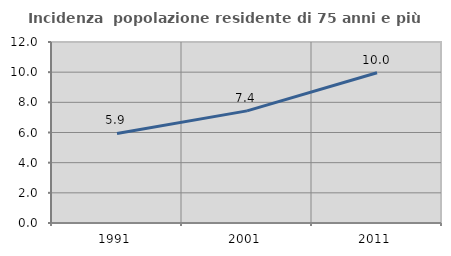
| Category | Incidenza  popolazione residente di 75 anni e più |
|---|---|
| 1991.0 | 5.94 |
| 2001.0 | 7.434 |
| 2011.0 | 9.965 |